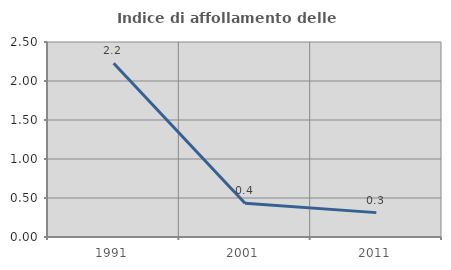
| Category | Indice di affollamento delle abitazioni  |
|---|---|
| 1991.0 | 2.228 |
| 2001.0 | 0.432 |
| 2011.0 | 0.312 |